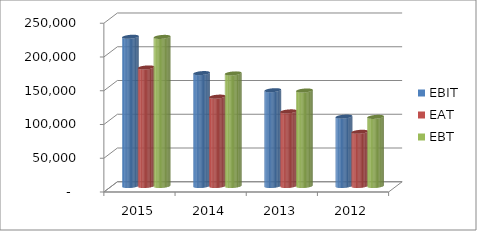
| Category | EBIT | EAT | EBT |
|---|---|---|---|
| 2015.0 | 221076 | 175640 | 220868 |
| 2014.0 | 167240 | 132370 | 166769 |
| 2013.0 | 141899 | 110518 | 141462 |
| 2012.0 | 102807 | 80299 | 102400 |